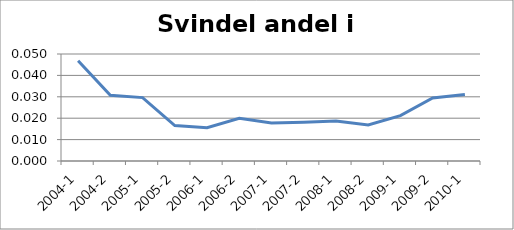
| Category | Svindel andel i % |
|---|---|
| 2004-1 | 0.047 |
| 2004-2 | 0.031 |
| 2005-1 | 0.03 |
| 2005-2 | 0.017 |
| 2006-1 | 0.016 |
| 2006-2 | 0.02 |
| 2007-1 | 0.018 |
| 2007-2 | 0.018 |
| 2008-1 | 0.019 |
| 2008-2 | 0.017 |
| 2009-1 | 0.021 |
| 2009-2 | 0.029 |
| 2010-1 | 0.031 |